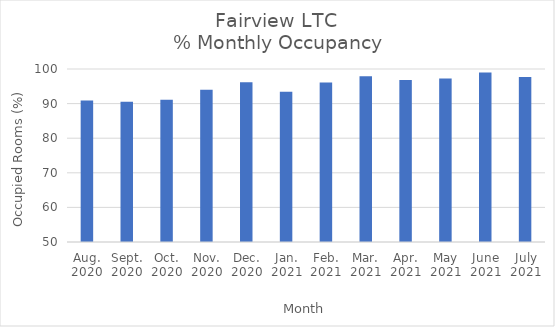
| Category | % Monthly Occupancy |
|---|---|
| Aug.
2020 | 90.9 |
| Sept.
2020 | 90.56 |
| Oct.
2020 | 91.1 |
| Nov.
2020 | 94 |
| Dec.
2020 | 96.2 |
| Jan.
2021 | 93.4 |
| Feb.
2021 | 96.09 |
| Mar.
2021 | 97.89 |
| Apr.
2021 | 96.83 |
| May
2021 | 97.24 |
| June
2021 | 99 |
| July
2021 | 97.7 |